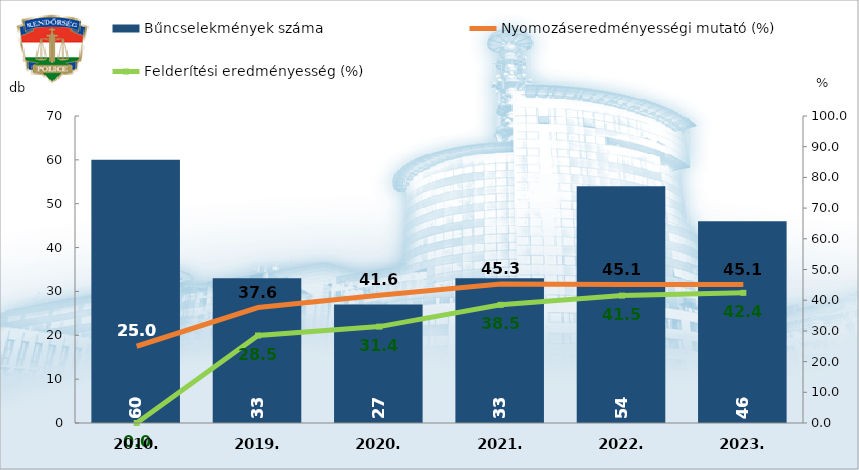
| Category | Bűncselekmények száma |
|---|---|
| 2010. | 60 |
| 2019. | 33 |
| 2020. | 27 |
| 2021. | 33 |
| 2022. | 54 |
| 2023. | 46 |